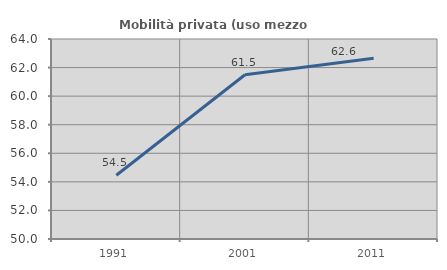
| Category | Mobilità privata (uso mezzo privato) |
|---|---|
| 1991.0 | 54.462 |
| 2001.0 | 61.501 |
| 2011.0 | 62.646 |